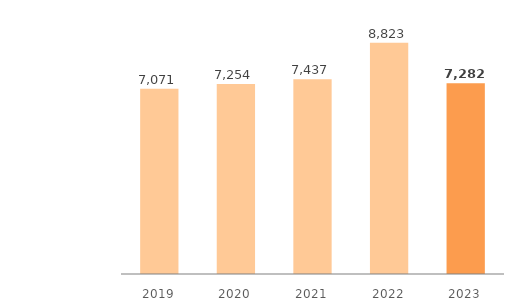
| Category | Assets in Kazakhstan |
|---|---|
| 2019.0 | 7071 |
| 2020.0 | 7254 |
| 2021.0 | 7437 |
| 2022.0 | 8823 |
| 2023.0 | 7282 |